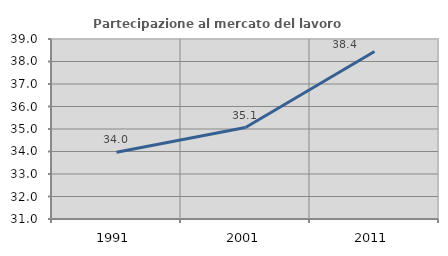
| Category | Partecipazione al mercato del lavoro  femminile |
|---|---|
| 1991.0 | 33.966 |
| 2001.0 | 35.064 |
| 2011.0 | 38.445 |